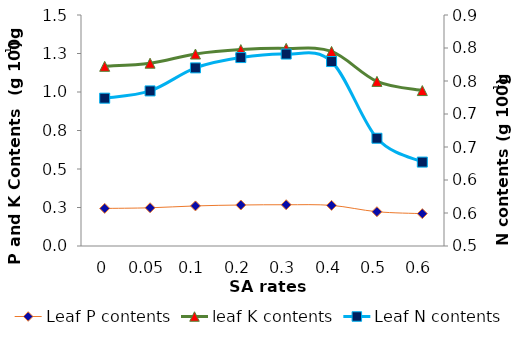
| Category | Leaf P contents | leaf K contents |
|---|---|---|
| 0.0 | 0.244 | 0.923 |
| 0.05 | 0.248 | 0.939 |
| 0.1 | 0.26 | 0.986 |
| 0.2 | 0.266 | 1.009 |
| 0.3 | 0.268 | 1.015 |
| 0.4 | 0.264 | 0.999 |
| 0.5 | 0.223 | 0.846 |
| 0.6 | 0.21 | 0.799 |